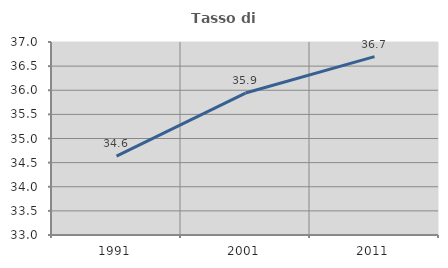
| Category | Tasso di occupazione   |
|---|---|
| 1991.0 | 34.637 |
| 2001.0 | 35.942 |
| 2011.0 | 36.696 |